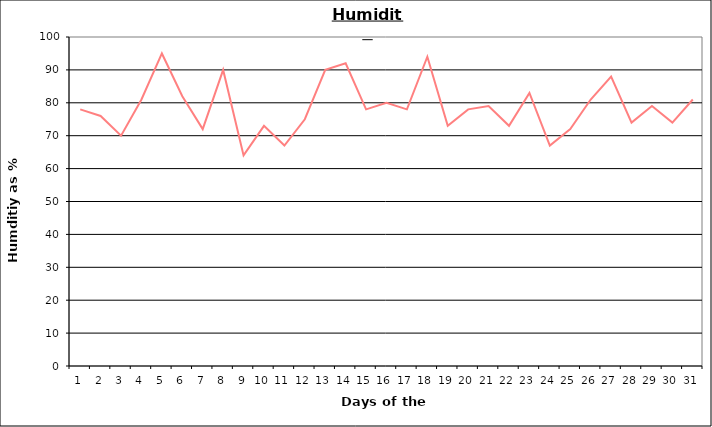
| Category | Series 0 |
|---|---|
| 0 | 78 |
| 1 | 76 |
| 2 | 70 |
| 3 | 81 |
| 4 | 95 |
| 5 | 82 |
| 6 | 72 |
| 7 | 90 |
| 8 | 64 |
| 9 | 73 |
| 10 | 67 |
| 11 | 75 |
| 12 | 90 |
| 13 | 92 |
| 14 | 78 |
| 15 | 80 |
| 16 | 78 |
| 17 | 94 |
| 18 | 73 |
| 19 | 78 |
| 20 | 79 |
| 21 | 73 |
| 22 | 83 |
| 23 | 67 |
| 24 | 72 |
| 25 | 81 |
| 26 | 88 |
| 27 | 74 |
| 28 | 79 |
| 29 | 74 |
| 30 | 81 |